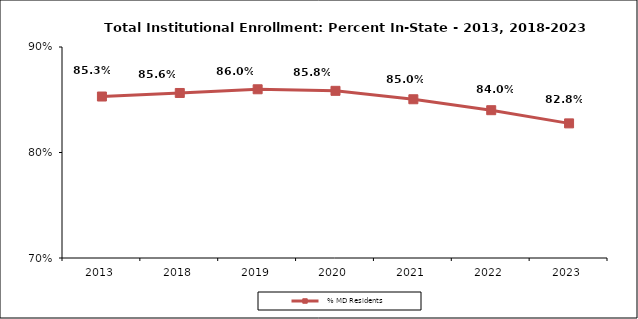
| Category |   % MD Residents |
|---|---|
| 2013.0 | 0.853 |
| 2018.0 | 0.856 |
| 2019.0 | 0.86 |
| 2020.0 | 0.858 |
| 2021.0 | 0.85 |
| 2022.0 | 0.84 |
| 2023.0 | 0.828 |